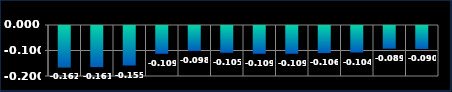
| Category | Series 0 |
|---|---|
| 0 | -0.162 |
| 1 | -0.161 |
| 2 | -0.155 |
| 3 | -0.109 |
| 4 | -0.098 |
| 5 | -0.105 |
| 6 | -0.109 |
| 7 | -0.109 |
| 8 | -0.106 |
| 9 | -0.104 |
| 10 | -0.089 |
| 11 | -0.09 |